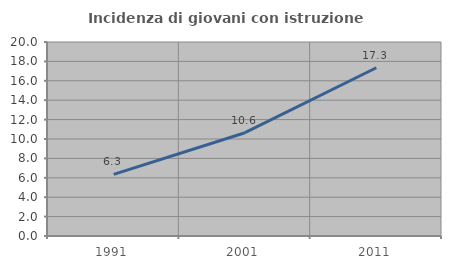
| Category | Incidenza di giovani con istruzione universitaria |
|---|---|
| 1991.0 | 6.349 |
| 2001.0 | 10.648 |
| 2011.0 | 17.347 |